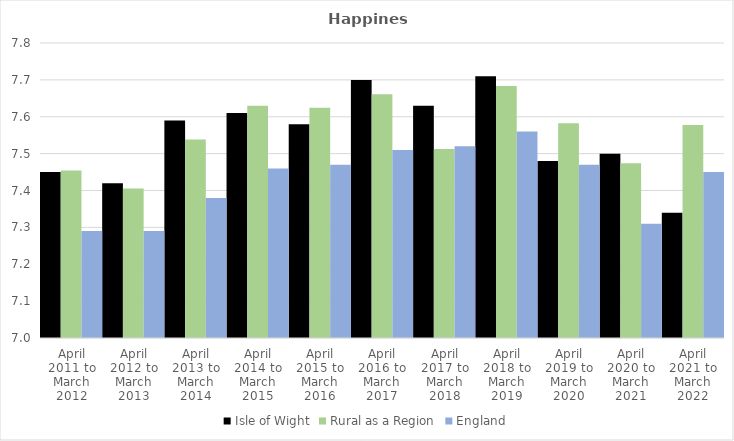
| Category | Isle of Wight | Rural as a Region | England |
|---|---|---|---|
| April 2011 to March 2012 | 7.45 | 7.454 | 7.29 |
| April 2012 to March 2013 | 7.42 | 7.406 | 7.29 |
| April 2013 to March 2014 | 7.59 | 7.539 | 7.38 |
| April 2014 to March 2015 | 7.61 | 7.63 | 7.46 |
| April 2015 to March 2016 | 7.58 | 7.625 | 7.47 |
| April 2016 to March 2017 | 7.7 | 7.661 | 7.51 |
| April 2017 to March 2018 | 7.63 | 7.513 | 7.52 |
| April 2018 to March 2019 | 7.71 | 7.684 | 7.56 |
| April 2019 to March 2020 | 7.48 | 7.582 | 7.47 |
| April 2020 to March 2021 | 7.5 | 7.474 | 7.31 |
| April 2021 to March 2022 | 7.34 | 7.577 | 7.45 |